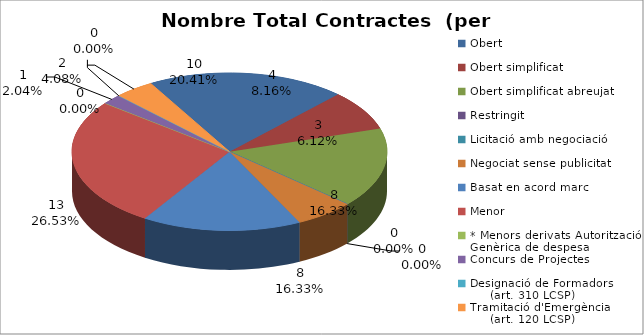
| Category | Nombre Total Contractes |
|---|---|
| Obert | 10 |
| Obert simplificat | 4 |
| Obert simplificat abreujat | 8 |
| Restringit | 0 |
| Licitació amb negociació | 0 |
| Negociat sense publicitat | 3 |
| Basat en acord marc | 8 |
| Menor | 13 |
| * Menors derivats Autorització Genèrica de despesa | 0 |
| Concurs de Projectes | 1 |
| Designació de Formadors
     (art. 310 LCSP) | 0 |
| Tramitació d'Emergència
     (art. 120 LCSP) | 2 |